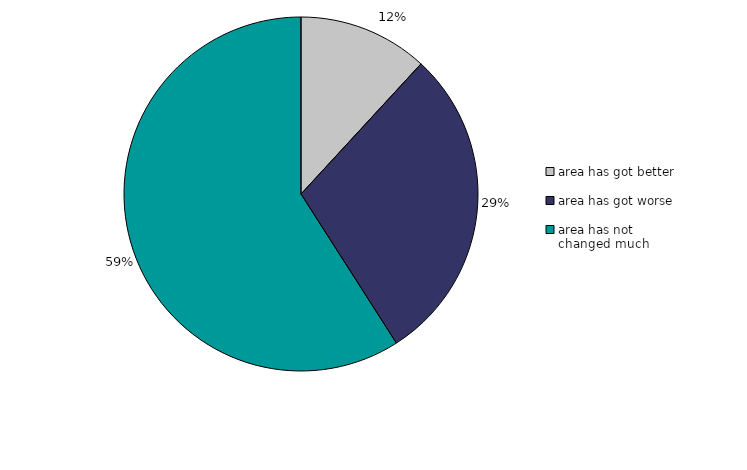
| Category | Series 0 |
|---|---|
| area has got better | 11.854 |
| area has got worse | 29.086 |
| area has not changed much | 59.06 |